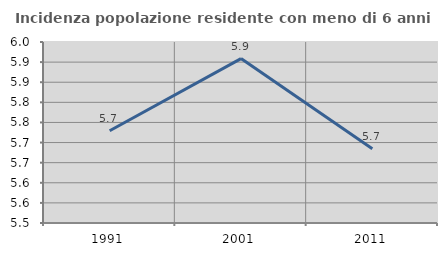
| Category | Incidenza popolazione residente con meno di 6 anni |
|---|---|
| 1991.0 | 5.729 |
| 2001.0 | 5.909 |
| 2011.0 | 5.685 |